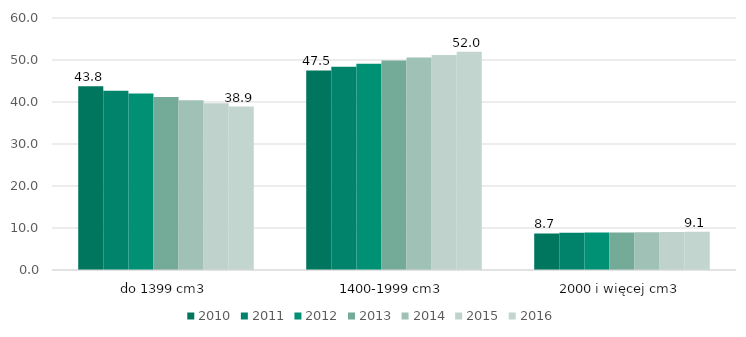
| Category | 2010 | 2011 | 2012 | 2013 | 2014 | 2015 | 2016 |
|---|---|---|---|---|---|---|---|
| do 1399 cm3 | 43.779 | 42.691 | 41.999 | 41.184 | 40.406 | 39.729 | 38.922 |
| 1400-1999 cm3 | 47.508 | 48.411 | 49.085 | 49.885 | 50.591 | 51.22 | 51.956 |
| 2000 i więcej cm3 | 8.713 | 8.898 | 8.916 | 8.931 | 9.004 | 9.051 | 9.122 |